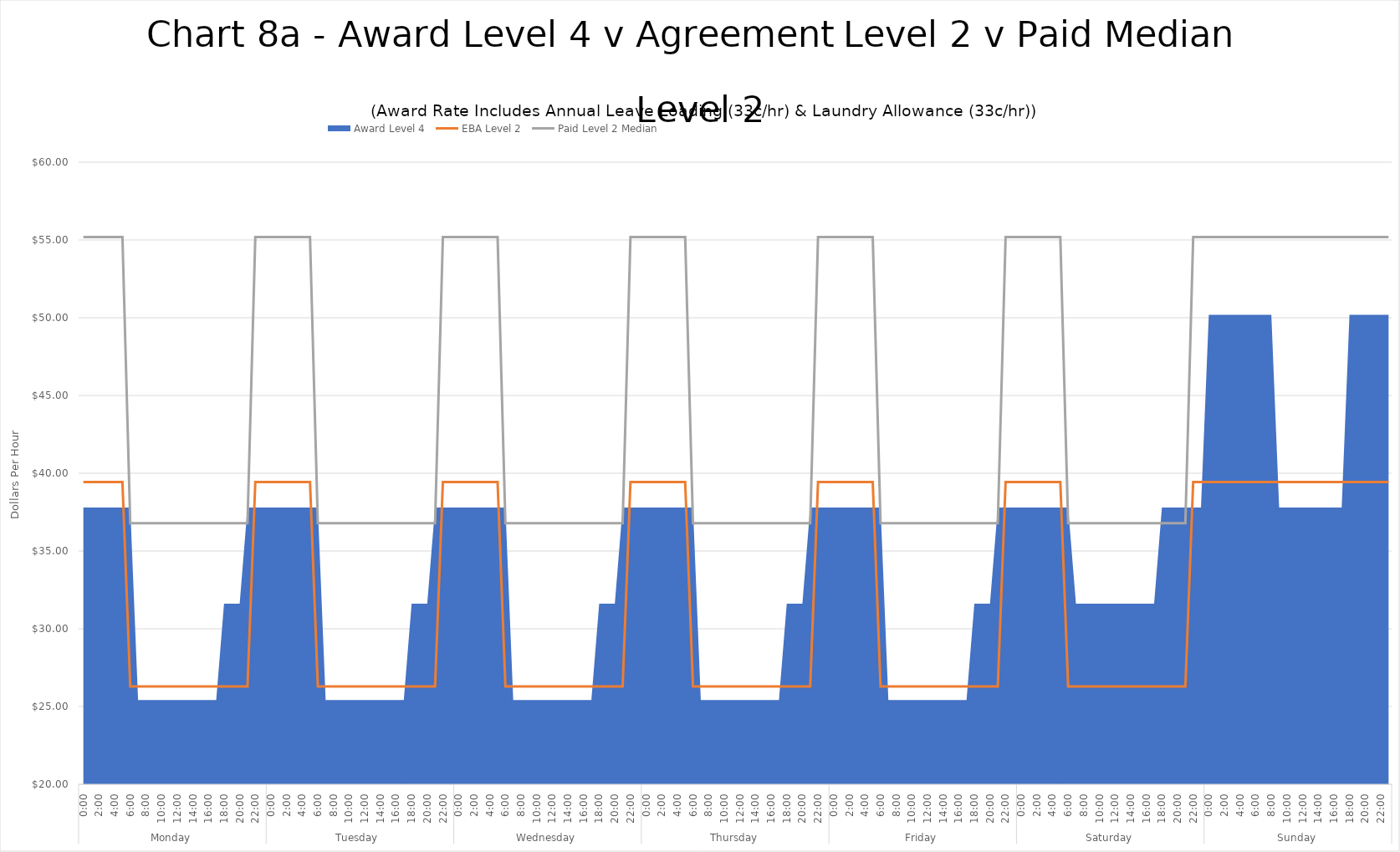
| Category | EBA Level 2 | Paid Level 2 Median |
|---|---|---|
| 0 | 39.435 | 55.185 |
| 1 | 39.435 | 55.185 |
| 2 | 39.435 | 55.185 |
| 3 | 39.435 | 55.185 |
| 4 | 39.435 | 55.185 |
| 5 | 39.435 | 55.185 |
| 6 | 26.29 | 36.79 |
| 7 | 26.29 | 36.79 |
| 8 | 26.29 | 36.79 |
| 9 | 26.29 | 36.79 |
| 10 | 26.29 | 36.79 |
| 11 | 26.29 | 36.79 |
| 12 | 26.29 | 36.79 |
| 13 | 26.29 | 36.79 |
| 14 | 26.29 | 36.79 |
| 15 | 26.29 | 36.79 |
| 16 | 26.29 | 36.79 |
| 17 | 26.29 | 36.79 |
| 18 | 26.29 | 36.79 |
| 19 | 26.29 | 36.79 |
| 20 | 26.29 | 36.79 |
| 21 | 26.29 | 36.79 |
| 22 | 39.435 | 55.185 |
| 23 | 39.435 | 55.185 |
| 24 | 39.435 | 55.185 |
| 25 | 39.435 | 55.185 |
| 26 | 39.435 | 55.185 |
| 27 | 39.435 | 55.185 |
| 28 | 39.435 | 55.185 |
| 29 | 39.435 | 55.185 |
| 30 | 26.29 | 36.79 |
| 31 | 26.29 | 36.79 |
| 32 | 26.29 | 36.79 |
| 33 | 26.29 | 36.79 |
| 34 | 26.29 | 36.79 |
| 35 | 26.29 | 36.79 |
| 36 | 26.29 | 36.79 |
| 37 | 26.29 | 36.79 |
| 38 | 26.29 | 36.79 |
| 39 | 26.29 | 36.79 |
| 40 | 26.29 | 36.79 |
| 41 | 26.29 | 36.79 |
| 42 | 26.29 | 36.79 |
| 43 | 26.29 | 36.79 |
| 44 | 26.29 | 36.79 |
| 45 | 26.29 | 36.79 |
| 46 | 39.435 | 55.185 |
| 47 | 39.435 | 55.185 |
| 48 | 39.435 | 55.185 |
| 49 | 39.435 | 55.185 |
| 50 | 39.435 | 55.185 |
| 51 | 39.435 | 55.185 |
| 52 | 39.435 | 55.185 |
| 53 | 39.435 | 55.185 |
| 54 | 26.29 | 36.79 |
| 55 | 26.29 | 36.79 |
| 56 | 26.29 | 36.79 |
| 57 | 26.29 | 36.79 |
| 58 | 26.29 | 36.79 |
| 59 | 26.29 | 36.79 |
| 60 | 26.29 | 36.79 |
| 61 | 26.29 | 36.79 |
| 62 | 26.29 | 36.79 |
| 63 | 26.29 | 36.79 |
| 64 | 26.29 | 36.79 |
| 65 | 26.29 | 36.79 |
| 66 | 26.29 | 36.79 |
| 67 | 26.29 | 36.79 |
| 68 | 26.29 | 36.79 |
| 69 | 26.29 | 36.79 |
| 70 | 39.435 | 55.185 |
| 71 | 39.435 | 55.185 |
| 72 | 39.435 | 55.185 |
| 73 | 39.435 | 55.185 |
| 74 | 39.435 | 55.185 |
| 75 | 39.435 | 55.185 |
| 76 | 39.435 | 55.185 |
| 77 | 39.435 | 55.185 |
| 78 | 26.29 | 36.79 |
| 79 | 26.29 | 36.79 |
| 80 | 26.29 | 36.79 |
| 81 | 26.29 | 36.79 |
| 82 | 26.29 | 36.79 |
| 83 | 26.29 | 36.79 |
| 84 | 26.29 | 36.79 |
| 85 | 26.29 | 36.79 |
| 86 | 26.29 | 36.79 |
| 87 | 26.29 | 36.79 |
| 88 | 26.29 | 36.79 |
| 89 | 26.29 | 36.79 |
| 90 | 26.29 | 36.79 |
| 91 | 26.29 | 36.79 |
| 92 | 26.29 | 36.79 |
| 93 | 26.29 | 36.79 |
| 94 | 39.435 | 55.185 |
| 95 | 39.435 | 55.185 |
| 96 | 39.435 | 55.185 |
| 97 | 39.435 | 55.185 |
| 98 | 39.435 | 55.185 |
| 99 | 39.435 | 55.185 |
| 100 | 39.435 | 55.185 |
| 101 | 39.435 | 55.185 |
| 102 | 26.29 | 36.79 |
| 103 | 26.29 | 36.79 |
| 104 | 26.29 | 36.79 |
| 105 | 26.29 | 36.79 |
| 106 | 26.29 | 36.79 |
| 107 | 26.29 | 36.79 |
| 108 | 26.29 | 36.79 |
| 109 | 26.29 | 36.79 |
| 110 | 26.29 | 36.79 |
| 111 | 26.29 | 36.79 |
| 112 | 26.29 | 36.79 |
| 113 | 26.29 | 36.79 |
| 114 | 26.29 | 36.79 |
| 115 | 26.29 | 36.79 |
| 116 | 26.29 | 36.79 |
| 117 | 26.29 | 36.79 |
| 118 | 39.435 | 55.185 |
| 119 | 39.435 | 55.185 |
| 120 | 39.435 | 55.185 |
| 121 | 39.435 | 55.185 |
| 122 | 39.435 | 55.185 |
| 123 | 39.435 | 55.185 |
| 124 | 39.435 | 55.185 |
| 125 | 39.435 | 55.185 |
| 126 | 26.29 | 36.79 |
| 127 | 26.29 | 36.79 |
| 128 | 26.29 | 36.79 |
| 129 | 26.29 | 36.79 |
| 130 | 26.29 | 36.79 |
| 131 | 26.29 | 36.79 |
| 132 | 26.29 | 36.79 |
| 133 | 26.29 | 36.79 |
| 134 | 26.29 | 36.79 |
| 135 | 26.29 | 36.79 |
| 136 | 26.29 | 36.79 |
| 137 | 26.29 | 36.79 |
| 138 | 26.29 | 36.79 |
| 139 | 26.29 | 36.79 |
| 140 | 26.29 | 36.79 |
| 141 | 26.29 | 36.79 |
| 142 | 39.435 | 55.185 |
| 143 | 39.435 | 55.185 |
| 144 | 39.435 | 55.185 |
| 145 | 39.435 | 55.185 |
| 146 | 39.435 | 55.185 |
| 147 | 39.435 | 55.185 |
| 148 | 39.435 | 55.185 |
| 149 | 39.435 | 55.185 |
| 150 | 39.435 | 55.185 |
| 151 | 39.435 | 55.185 |
| 152 | 39.435 | 55.185 |
| 153 | 39.435 | 55.185 |
| 154 | 39.435 | 55.185 |
| 155 | 39.435 | 55.185 |
| 156 | 39.435 | 55.185 |
| 157 | 39.435 | 55.185 |
| 158 | 39.435 | 55.185 |
| 159 | 39.435 | 55.185 |
| 160 | 39.435 | 55.185 |
| 161 | 39.435 | 55.185 |
| 162 | 39.435 | 55.185 |
| 163 | 39.435 | 55.185 |
| 164 | 39.435 | 55.185 |
| 165 | 39.435 | 55.185 |
| 166 | 39.435 | 55.185 |
| 167 | 39.435 | 55.185 |